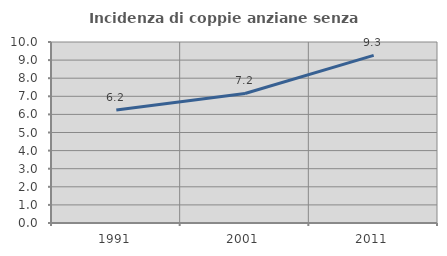
| Category | Incidenza di coppie anziane senza figli  |
|---|---|
| 1991.0 | 6.244 |
| 2001.0 | 7.155 |
| 2011.0 | 9.261 |